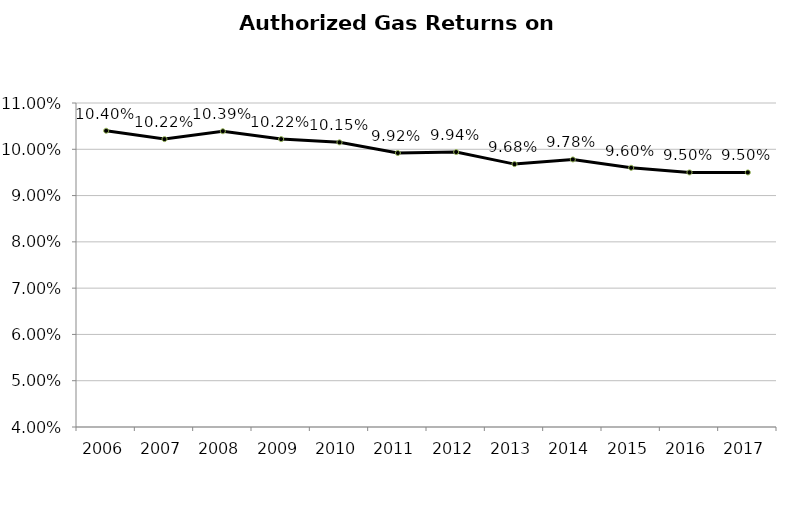
| Category | Series 2 |
|---|---|
| 2006 | 0.104 |
| 2007 | 0.102 |
| 2008 | 0.104 |
| 2009 | 0.102 |
| 2010 | 0.102 |
| 2011 | 0.099 |
| 2012 | 0.099 |
| 2013 | 0.097 |
| 2014 | 0.098 |
| 2015 | 0.096 |
| 2016 | 0.095 |
| 2017 | 0.095 |